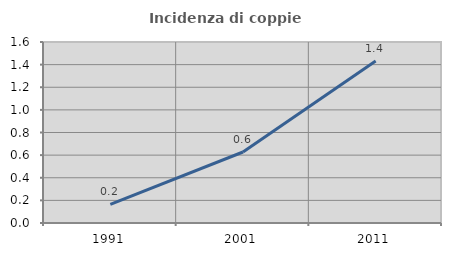
| Category | Incidenza di coppie miste |
|---|---|
| 1991.0 | 0.164 |
| 2001.0 | 0.627 |
| 2011.0 | 1.433 |